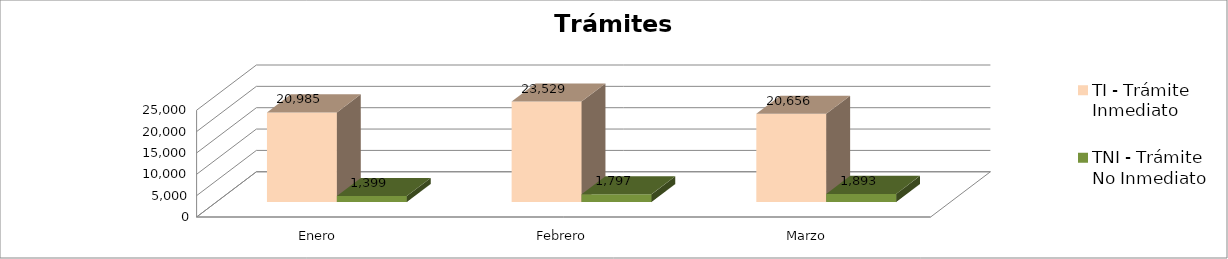
| Category | TI - Trámite Inmediato | TNI - Trámite No Inmediato |
|---|---|---|
| Enero | 20985 | 1399 |
| Febrero | 23529 | 1797 |
| Marzo | 20656 | 1893 |